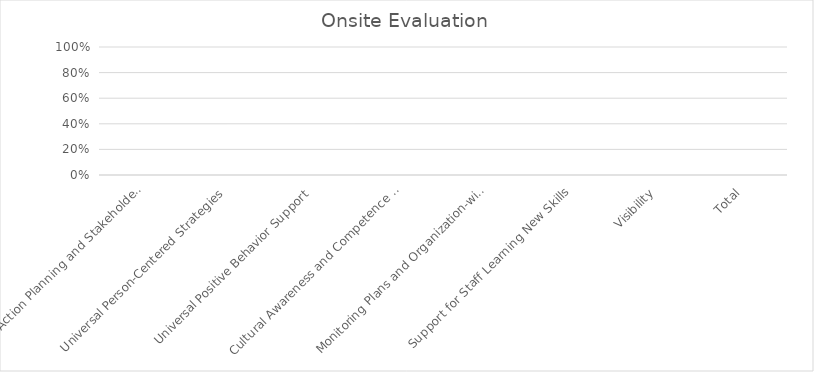
| Category | Date |
|---|---|
| Team Action Planning and Stakeholder Involvement | 0 |
| Universal Person-Centered Strategies | 0 |
| Universal Positive Behavior Support | 0 |
| Cultural Awareness and Competence Strategies | 0 |
| Monitoring Plans and Organization-wide Data for Decision Making | 0 |
| Support for Staff Learning New Skills | 0 |
| Visibility | 0 |
| Total | 0 |